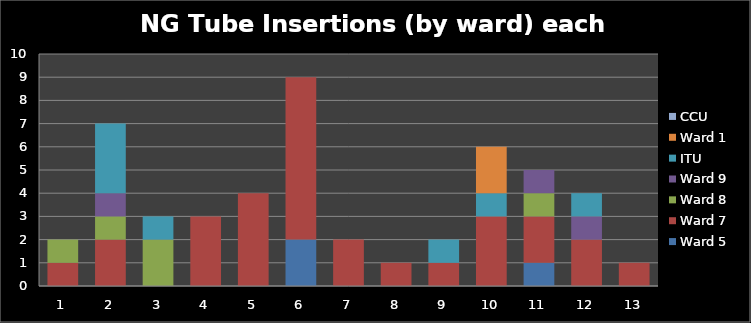
| Category | Ward 5 | Ward 7 | Ward 8 | Ward 9  | ITU | Ward 1 | CCU |
|---|---|---|---|---|---|---|---|
| 0 | 0 | 1 | 1 | 0 | 0 | 0 | 0 |
| 1 | 0 | 2 | 1 | 1 | 3 | 0 | 0 |
| 2 | 0 | 0 | 2 | 0 | 1 | 0 | 0 |
| 3 | 0 | 3 | 0 | 0 | 0 | 0 | 0 |
| 4 | 0 | 4 | 0 | 0 | 0 | 0 | 0 |
| 5 | 2 | 7 | 0 | 0 | 0 | 0 | 0 |
| 6 | 0 | 2 | 0 | 0 | 0 | 0 | 0 |
| 7 | 0 | 1 | 0 | 0 | 0 | 0 | 0 |
| 8 | 0 | 1 | 0 | 0 | 1 | 0 | 0 |
| 9 | 0 | 3 | 0 | 0 | 1 | 2 | 0 |
| 10 | 1 | 2 | 1 | 1 | 0 | 0 | 0 |
| 11 | 0 | 2 | 0 | 1 | 1 | 0 | 0 |
| 12 | 0 | 1 | 0 | 0 | 0 | 0 | 0 |